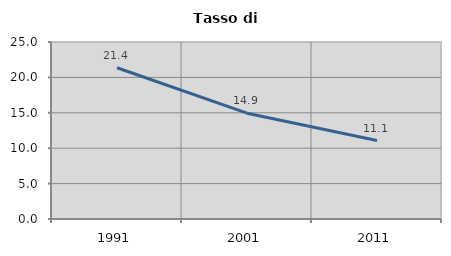
| Category | Tasso di disoccupazione   |
|---|---|
| 1991.0 | 21.364 |
| 2001.0 | 14.946 |
| 2011.0 | 11.08 |